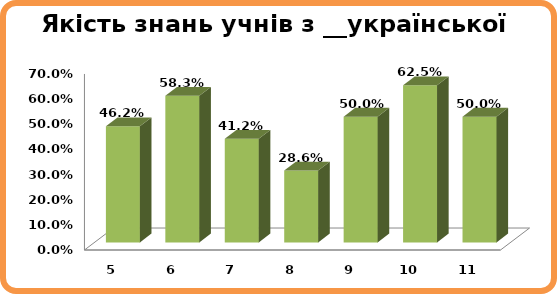
| Category | Series 0 |
|---|---|
| 5.0 | 0.462 |
| 6.0 | 0.583 |
| 7.0 | 0.412 |
| 8.0 | 0.286 |
| 9.0 | 0.5 |
| 10.0 | 0.625 |
| 11.0 | 0.5 |